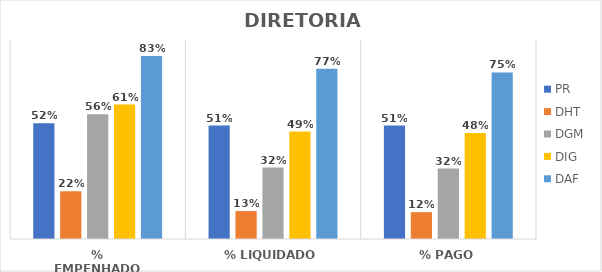
| Category | PR | DHT | DGM | DIG | DAF |
|---|---|---|---|---|---|
| % EMPENHADO | 0.523 | 0.216 | 0.564 | 0.608 | 0.828 |
| % LIQUIDADO | 0.513 | 0.126 | 0.323 | 0.486 | 0.77 |
| % PAGO | 0.513 | 0.121 | 0.319 | 0.48 | 0.754 |